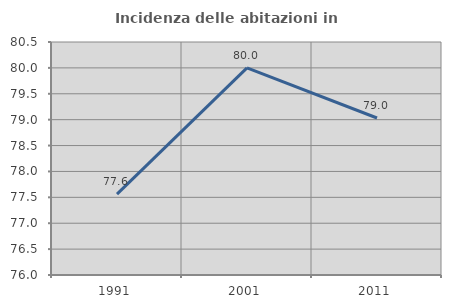
| Category | Incidenza delle abitazioni in proprietà  |
|---|---|
| 1991.0 | 77.563 |
| 2001.0 | 80 |
| 2011.0 | 79.032 |